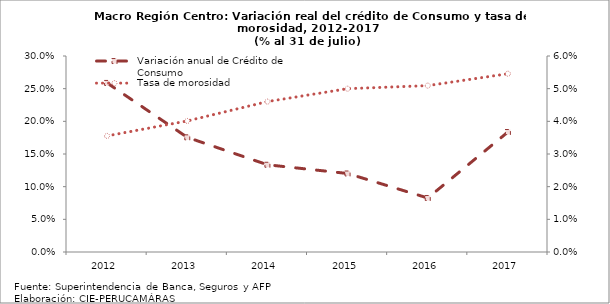
| Category | Variación anual de Crédito de Consumo |
|---|---|
| 2012.0 | 0.259 |
| 2013.0 | 0.176 |
| 2014.0 | 0.134 |
| 2015.0 | 0.12 |
| 2016.0 | 0.083 |
| 2017.0 | 0.184 |